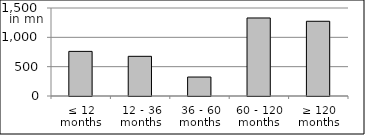
| Category | volume |
|---|---|
| ≤ 12 months | 760623210.42 |
| 12 - 36 months | 676337744.67 |
| 36 - 60 months | 323143320.66 |
| 60 - 120 months | 1330076665.475 |
| ≥ 120 months | 1273763509.129 |